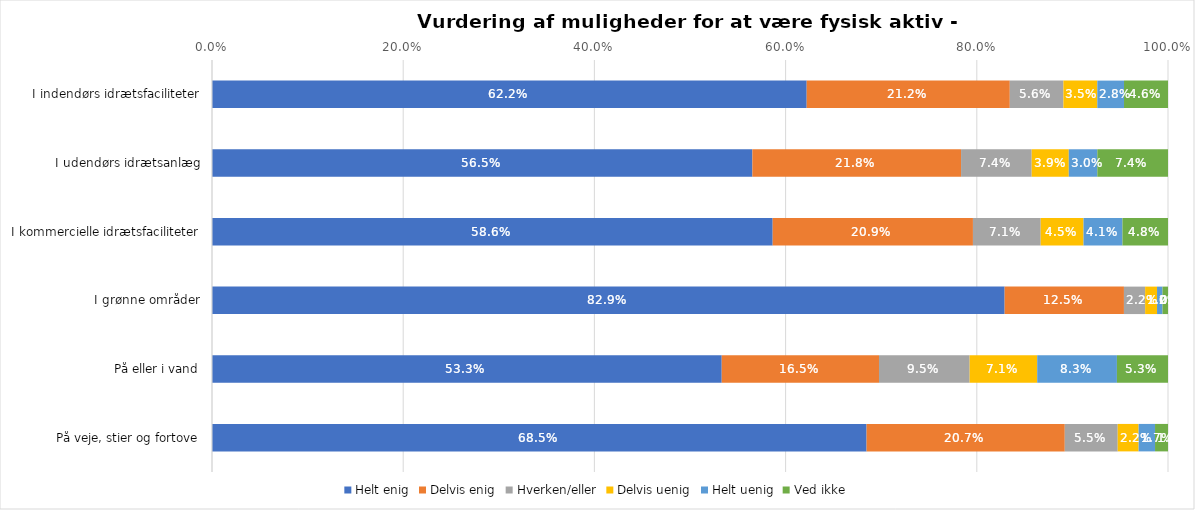
| Category | Helt enig | Delvis enig | Hverken/eller | Delvis uenig | Helt uenig | Ved ikke |
|---|---|---|---|---|---|---|
| I indendørs idrætsfaciliteter | 0.622 | 0.212 | 0.056 | 0.035 | 0.028 | 0.046 |
| I udendørs idrætsanlæg | 0.565 | 0.218 | 0.074 | 0.039 | 0.03 | 0.074 |
| I kommercielle idrætsfaciliteter | 0.586 | 0.209 | 0.071 | 0.045 | 0.041 | 0.048 |
| I grønne områder | 0.829 | 0.125 | 0.022 | 0.012 | 0.006 | 0.006 |
| På eller i vand | 0.533 | 0.165 | 0.095 | 0.071 | 0.083 | 0.053 |
| På veje, stier og fortove | 0.685 | 0.207 | 0.055 | 0.022 | 0.017 | 0.014 |